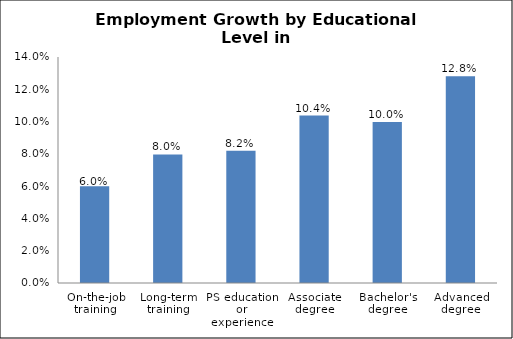
| Category | Series 0 |
|---|---|
| On-the-job training | 0.06 |
| Long-term training | 0.08 |
| PS education or experience | 0.082 |
| Associate degree | 0.104 |
| Bachelor's degree | 0.1 |
| Advanced degree | 0.128 |